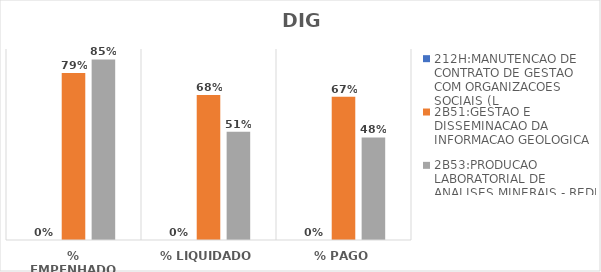
| Category | 212H:MANUTENCAO DE CONTRATO DE GESTAO COM ORGANIZACOES SOCIAIS (L | 2B51:GESTAO E DISSEMINACAO DA INFORMACAO GEOLOGICA | 2B53:PRODUCAO LABORATORIAL DE ANALISES MINERAIS - REDE LAMIN |
|---|---|---|---|
| % EMPENHADO | 0 | 0.787 | 0.851 |
| % LIQUIDADO | 0 | 0.683 | 0.51 |
| % PAGO | 0 | 0.675 | 0.484 |